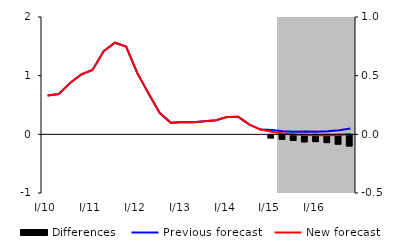
| Category | Differences |
|---|---|
| 0 | 0 |
| 1 | 0 |
| 2 | 0 |
| 3 | 0 |
| 4 | 0 |
| 5 | 0 |
| 6 | 0 |
| 7 | 0 |
| 8 | 0 |
| 9 | 0 |
| 10 | 0 |
| 11 | 0 |
| 12 | 0 |
| 13 | 0 |
| 14 | 0 |
| 15 | 0 |
| 16 | 0 |
| 17 | 0 |
| 18 | 0 |
| 19 | 0 |
| 20 | -0.026 |
| 21 | -0.037 |
| 22 | -0.048 |
| 23 | -0.06 |
| 24 | -0.058 |
| 25 | -0.066 |
| 26 | -0.079 |
| 27 | -0.095 |